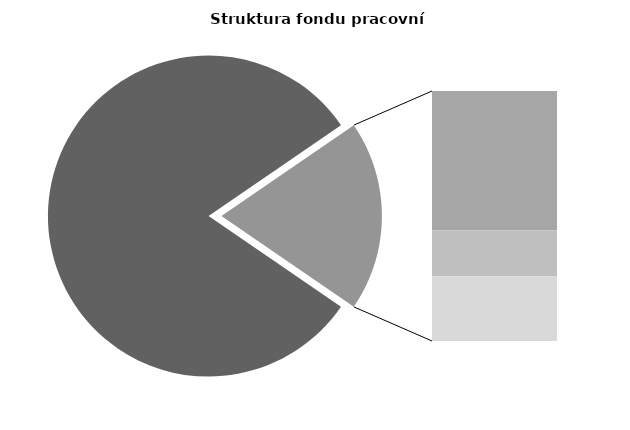
| Category | Series 0 |
|---|---|
| Průměrná měsíční odpracovaná doba bez přesčasu | 138.348 |
| Dovolená | 18.293 |
| Nemoc | 5.972 |
| Jiné | 8.499 |